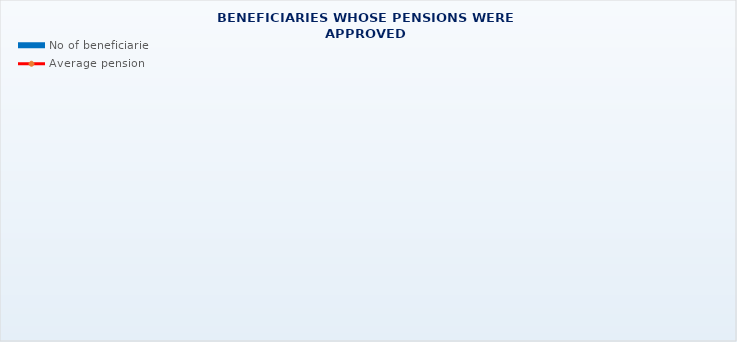
| Category | No of beneficiaries |
|---|---|
| Authorised officials in internal affairs, judicial officers and workers engaged in demining work: | 17264 |
| Pension beneficiaries entitled under the Fire Services Act (Official Gazette 125/19)* | 32 |
| Active military personnel - DVO  | 15812 |
| Croatian Homeland Army veterans mobilised from 1941 to 1945 | 3621 |
| Former political prisoners | 2708 |
| Croatian Veterans from the Homeland War - ZOHBDR (Act on Croatian Homeland War Veterans and Their Family Members) | 71136 |
| Pensions approved under general regulations and determined according to the Act on the Rights of Croatian Homeland War Veterans and their Family Members (ZOHBDR), in 2017 (Art. 27, 35, 48 and 49, paragraph 2)    | 45445 |
| Former Yugoslav People's Army members - JNA   | 5103 |
| Former Yugoslav People's Army members - JNA - Art. 185 of Pension Insurance Act (ZOMO)  | 150 |
| National Liberation War veterans - NOR | 8719 |
| Members of the Croatian Parliament, members of the Government, judges of the Constitutional Court and the Auditor General | 681 |
| Members of the Parliamentary Executive Council and administratively retired federal civil servants  (relates to the former SFRY) | 91 |
| Former officials of federal bodies o the former SFRJ -  Article 38 of the Pension Insurance Act (ZOMO) | 31 |
| Full members of the Croatian Academy of Sciences and Arts - HAZU | 135 |
| Miners from the Istrian coal mines "Tupljak" d.d. Labin  | 254 |
| Workers professionally exposed to asbestos | 861 |
| Insurees - crew members on a ship in international and national navigation  - Article  129, paragraph 2 of the Maritime Code | 182 |
| Members of the Croatian Defence Council - HVO  | 6749 |